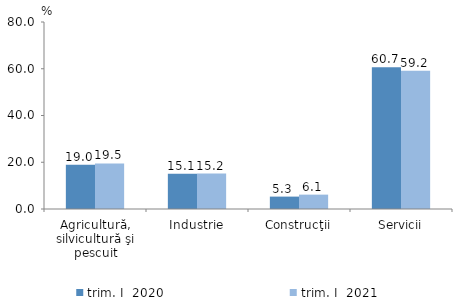
| Category | trim. I  2020 | trim. I  2021 |
|---|---|---|
| Agricultură, silvicultură şi pescuit | 18.97 | 19.507 |
| Industrie | 15.068 | 15.182 |
| Construcţii | 5.302 | 6.148 |
| Servicii | 60.659 | 59.163 |